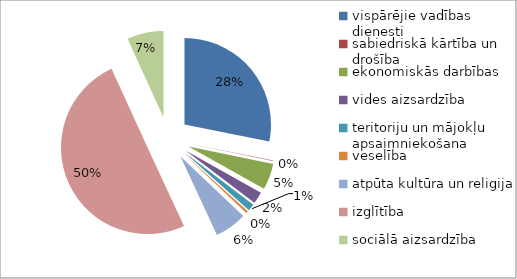
| Category | Series 0 |
|---|---|
| vispārējie vadības dienesti | 420866 |
| sabiedriskā kārtība un drošība | 1669 |
| ekonomiskās darbības | 72780 |
| vides aizsardzība | 33206 |
| teritoriju un mājokļu apsaimniekošana | 19428 |
| veselība | 6442 |
| atpūta kultūra un religija | 89705 |
| izglītība | 749167 |
| sociālā aizsardzība | 102015 |